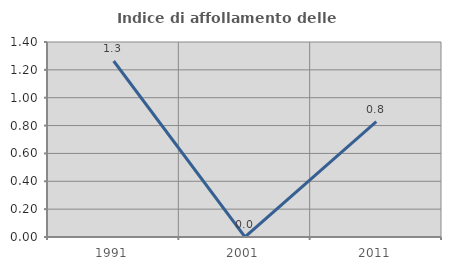
| Category | Indice di affollamento delle abitazioni  |
|---|---|
| 1991.0 | 1.264 |
| 2001.0 | 0 |
| 2011.0 | 0.828 |